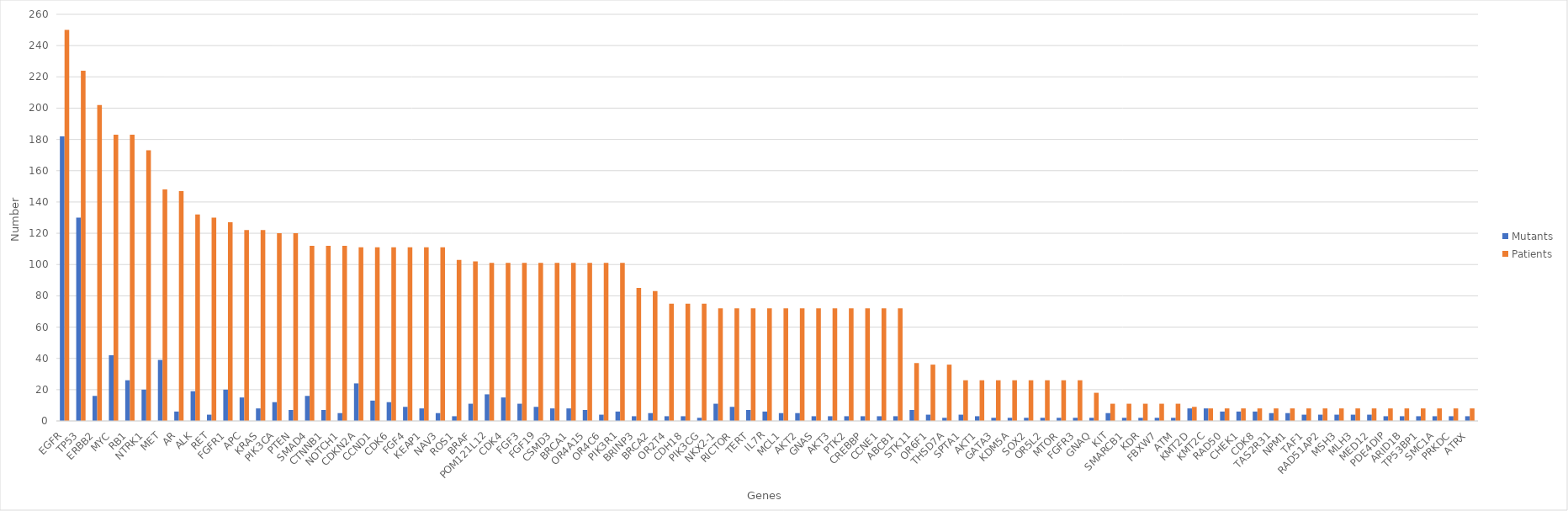
| Category | Mutants | Patients |
|---|---|---|
| EGFR | 182 | 250 |
| TP53 | 130 | 224 |
| ERBB2 | 16 | 202 |
| MYC | 42 | 183 |
| RB1 | 26 | 183 |
| NTRK1 | 20 | 173 |
| MET | 39 | 148 |
| AR | 6 | 147 |
| ALK | 19 | 132 |
| RET | 4 | 130 |
| FGFR1 | 20 | 127 |
| APC | 15 | 122 |
| KRAS | 8 | 122 |
| PIK3CA | 12 | 120 |
| PTEN | 7 | 120 |
| SMAD4 | 16 | 112 |
| CTNNB1 | 7 | 112 |
| NOTCH1 | 5 | 112 |
| CDKN2A | 24 | 111 |
| CCND1 | 13 | 111 |
| CDK6 | 12 | 111 |
| FGF4 | 9 | 111 |
| KEAP1 | 8 | 111 |
| NAV3 | 5 | 111 |
| ROS1 | 3 | 103 |
| BRAF | 11 | 102 |
| POM121L12 | 17 | 101 |
| CDK4 | 15 | 101 |
| FGF3 | 11 | 101 |
| FGF19 | 9 | 101 |
| CSMD3 | 8 | 101 |
| BRCA1 | 8 | 101 |
| OR4A15 | 7 | 101 |
| OR4C6 | 4 | 101 |
| PIK3R1 | 6 | 101 |
| BRINP3 | 3 | 85 |
| BRCA2 | 5 | 83 |
| OR2T4 | 3 | 75 |
| CDH18 | 3 | 75 |
| PIK3CG | 2 | 75 |
| NKX2-1 | 11 | 72 |
| RICTOR | 9 | 72 |
| TERT | 7 | 72 |
| IL7R | 6 | 72 |
| MCL1 | 5 | 72 |
| AKT2 | 5 | 72 |
| GNAS | 3 | 72 |
| AKT3 | 3 | 72 |
| PTK2 | 3 | 72 |
| CREBBP | 3 | 72 |
| CCNE1 | 3 | 72 |
| ABCB1 | 3 | 72 |
| STK11 | 7 | 37 |
| OR6F1 | 4 | 36 |
| THSD7A | 2 | 36 |
| SPTA1 | 4 | 26 |
| AKT1 | 3 | 26 |
| GATA3 | 2 | 26 |
| KDM5A | 2 | 26 |
| SOX2 | 2 | 26 |
| OR5L2 | 2 | 26 |
| MTOR | 2 | 26 |
| FGFR3 | 2 | 26 |
| GNAQ | 2 | 18 |
| KIT | 5 | 11 |
| SMARCB1 | 2 | 11 |
| KDR | 2 | 11 |
| FBXW7 | 2 | 11 |
| ATM | 2 | 11 |
| KMT2D | 8 | 9 |
| KMT2C | 8 | 8 |
| RAD50 | 6 | 8 |
| CHEK1 | 6 | 8 |
| CDK8 | 6 | 8 |
| TAS2R31 | 5 | 8 |
| NPM1 | 5 | 8 |
| TAF1 | 4 | 8 |
| RAD51AP2 | 4 | 8 |
| MSH3 | 4 | 8 |
| MLH3 | 4 | 8 |
| MED12 | 4 | 8 |
| PDE4DIP | 3 | 8 |
| ARID1B | 3 | 8 |
| TP53BP1 | 3 | 8 |
| SMC1A | 3 | 8 |
| PRKDC | 3 | 8 |
| ATRX | 3 | 8 |